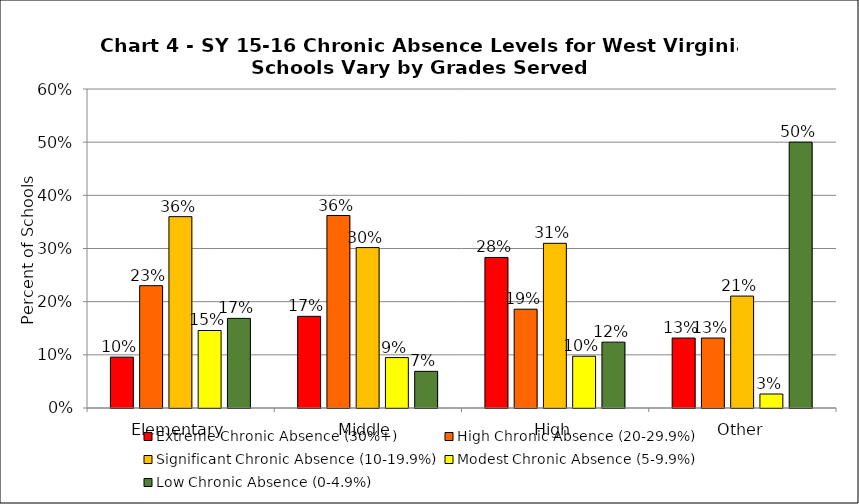
| Category | Extreme Chronic Absence (30%+) | High Chronic Absence (20-29.9%) | Significant Chronic Absence (10-19.9%) | Modest Chronic Absence (5-9.9%) | Low Chronic Absence (0-4.9%) |
|---|---|---|---|---|---|
| 0 | 0.096 | 0.23 | 0.36 | 0.146 | 0.169 |
| 1 | 0.172 | 0.362 | 0.302 | 0.095 | 0.069 |
| 2 | 0.283 | 0.186 | 0.31 | 0.097 | 0.124 |
| 3 | 0.132 | 0.132 | 0.211 | 0.026 | 0.5 |